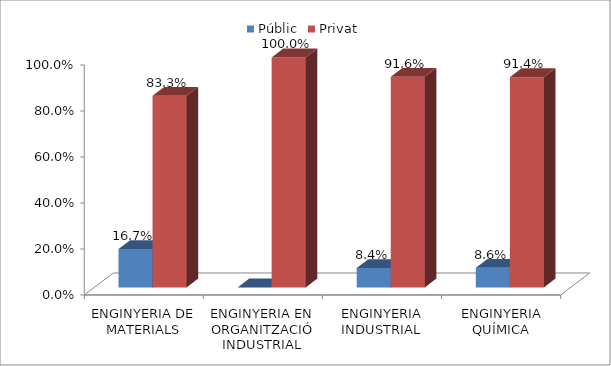
| Category | Públic | Privat |
|---|---|---|
| ENGINYERIA DE MATERIALS | 0.167 | 0.833 |
| ENGINYERIA EN ORGANITZACIÓ INDUSTRIAL | 0 | 1 |
| ENGINYERIA INDUSTRIAL | 0.084 | 0.916 |
| ENGINYERIA QUÍMICA | 0.086 | 0.914 |